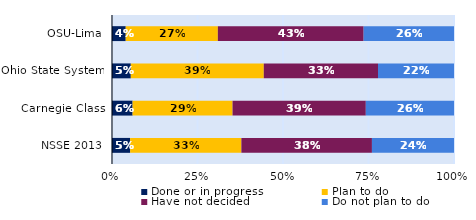
| Category | Done or in progress | Plan to do | Have not decided | Do not plan to do |
|---|---|---|---|---|
| OSU-Lima | 0.04 | 0.269 | 0.426 | 0.264 |
| Ohio State System | 0.055 | 0.389 | 0.334 | 0.222 |
| Carnegie Class | 0.06 | 0.292 | 0.39 | 0.258 |
| NSSE 2013 | 0.053 | 0.325 | 0.382 | 0.24 |